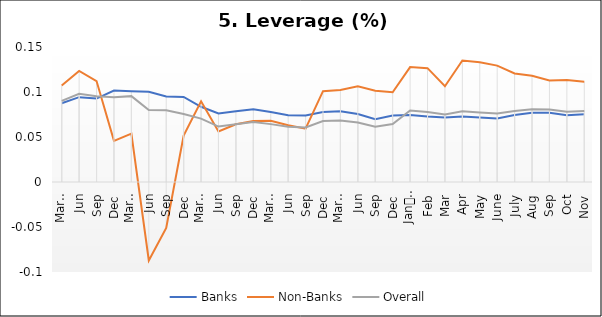
| Category | Banks | Non-Banks | Overall |
|---|---|---|---|
| 0 | 0.088 | 0.107 | 0.09 |
| 1 | 0.094 | 0.123 | 0.098 |
| 2 | 0.093 | 0.112 | 0.095 |
| 3 | 0.102 | 0.046 | 0.094 |
| 4 | 0.101 | 0.054 | 0.095 |
| 5 | 0.1 | -0.087 | 0.08 |
| 6 | 0.095 | -0.051 | 0.08 |
| 7 | 0.095 | 0.052 | 0.076 |
| 8 | 0.084 | 0.09 | 0.07 |
| 9 | 0.076 | 0.056 | 0.062 |
| 10 | 0.079 | 0.064 | 0.064 |
| 11 | 0.081 | 0.068 | 0.067 |
| 12 | 0.078 | 0.068 | 0.064 |
| 13 | 0.074 | 0.063 | 0.061 |
| 14 | 0.074 | 0.059 | 0.061 |
| 15 | 0.078 | 0.101 | 0.068 |
| 16 | 0.079 | 0.102 | 0.068 |
| 17 | 0.075 | 0.106 | 0.066 |
| 18 | 0.07 | 0.102 | 0.061 |
| 19 | 0.074 | 0.1 | 0.064 |
| 20 | 0.074 | 0.128 | 0.079 |
| 21 | 0.073 | 0.126 | 0.078 |
| 22 | 0.072 | 0.106 | 0.075 |
| 23 | 0.073 | 0.135 | 0.079 |
| 24 | 0.072 | 0.133 | 0.077 |
| 25 | 0.071 | 0.129 | 0.076 |
| 26 | 0.074 | 0.121 | 0.079 |
| 27 | 0.077 | 0.118 | 0.081 |
| 28 | 0.077 | 0.113 | 0.08 |
| 29 | 0.074 | 0.113 | 0.078 |
| 30 | 0.075 | 0.111 | 0.079 |